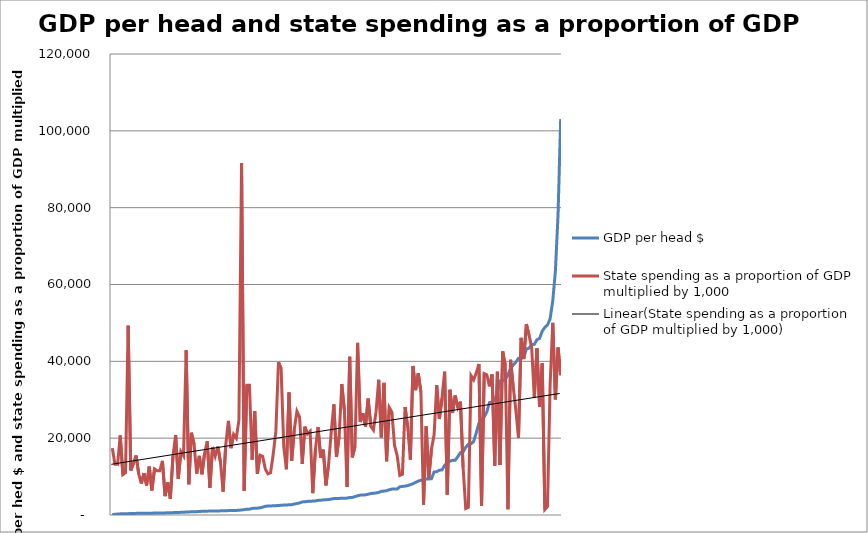
| Category | GDP per head $ | State spending as a proportion of GDP multiplied by 1,000 |
|---|---|---|
| 0 | 155.065 | 17400 |
| 1 | 163.799 | 13200 |
| 2 | 252.014 | 13200 |
| 3 | 291.231 | 20700 |
| 4 | 321.624 | 10500 |
| 5 | 331.068 | 11000 |
| 6 | 347.754 | 49300 |
| 7 | 407.973 | 11600 |
| 8 | 420.021 | 13400 |
| 9 | 422.566 | 15500 |
| 10 | 424.452 | 10700 |
| 11 | 425.61 | 8200 |
| 12 | 437.043 | 10900 |
| 13 | 440.746 | 7700 |
| 14 | 465.736 | 12600 |
| 15 | 482.193 | 6400 |
| 16 | 495.56 | 12000 |
| 17 | 497.636 | 11500 |
| 18 | 501.518 | 11500 |
| 19 | 510.363 | 14100 |
| 20 | 545.588 | 4900 |
| 21 | 574.791 | 8500 |
| 22 | 607.947 | 4200 |
| 23 | 617.552 | 15300 |
| 24 | 637.406 | 20800 |
| 25 | 643.698 | 9400 |
| 26 | 704.17 | 16500 |
| 27 | 724.273 | 15400 |
| 28 | 768.714 | 42900 |
| 29 | 806.211 | 8000 |
| 30 | 823.423 | 21400 |
| 31 | 847.449 | 18400 |
| 32 | 869.795 | 10800 |
| 33 | 899.881 | 15400 |
| 34 | 976.551 | 10600 |
| 35 | 980.614 | 16100 |
| 36 | 990.592 | 19200 |
| 37 | 1036.032 | 7100 |
| 38 | 1040.982 | 17700 |
| 39 | 1043.067 | 15300 |
| 40 | 1056.51 | 17800 |
| 41 | 1076.812 | 13800 |
| 42 | 1095.672 | 6100 |
| 43 | 1113.338 | 18200 |
| 44 | 1147.938 | 24500 |
| 45 | 1157.576 | 17400 |
| 46 | 1180.83 | 21000 |
| 47 | 1193.402 | 20000 |
| 48 | 1225.746 | 24700 |
| 49 | 1300 | 91600 |
| 50 | 1396.537 | 6300 |
| 51 | 1516.234 | 33800 |
| 52 | 1516.419 | 33800 |
| 53 | 1712.529 | 14400 |
| 54 | 1749.576 | 27000 |
| 55 | 1792.373 | 10700 |
| 56 | 1873.687 | 15600 |
| 57 | 2024.498 | 15300 |
| 58 | 2270.898 | 12000 |
| 59 | 2333.704 | 10700 |
| 60 | 2370.406 | 11000 |
| 61 | 2379.536 | 15800 |
| 62 | 2421.1 | 21700 |
| 63 | 2481.697 | 39800 |
| 64 | 2533.191 | 38100 |
| 65 | 2581.301 | 17800 |
| 66 | 2594.422 | 11900 |
| 67 | 2659.658 | 31900 |
| 68 | 2691.167 | 14100 |
| 69 | 2845.506 | 22300 |
| 70 | 3009.615 | 27000 |
| 71 | 3117.318 | 25500 |
| 72 | 3406.522 | 13300 |
| 73 | 3446.394 | 23000 |
| 74 | 3542.954 | 21100 |
| 75 | 3583.138 | 21800 |
| 76 | 3620.281 | 5700 |
| 77 | 3665.074 | 17000 |
| 78 | 3815.336 | 22900 |
| 79 | 3850.652 | 14900 |
| 80 | 3934.695 | 17000 |
| 81 | 3974.819 | 7700 |
| 82 | 4022.746 | 13200 |
| 83 | 4149.068 | 21600 |
| 84 | 4276.221 | 28800 |
| 85 | 4303.995 | 15100 |
| 86 | 4321.656 | 20500 |
| 87 | 4350.649 | 34100 |
| 88 | 4358.974 | 27200 |
| 89 | 4402.088 | 7300 |
| 90 | 4555.851 | 41200 |
| 91 | 4571.149 | 15000 |
| 92 | 4791.597 | 17800 |
| 93 | 5000.893 | 44800 |
| 94 | 5172.159 | 24200 |
| 95 | 5201.835 | 26500 |
| 96 | 5246.142 | 23000 |
| 97 | 5402.985 | 30300 |
| 98 | 5591.954 | 23100 |
| 99 | 5652.672 | 22100 |
| 100 | 5745.034 | 26900 |
| 101 | 5879.676 | 35200 |
| 102 | 6154.143 | 20200 |
| 103 | 6217.001 | 34400 |
| 104 | 6318.966 | 14000 |
| 105 | 6571.885 | 28000 |
| 106 | 6748.163 | 26800 |
| 107 | 6754.819 | 18100 |
| 108 | 6765.35 | 15500 |
| 109 | 7341.772 | 10300 |
| 110 | 7438.29 | 10600 |
| 111 | 7523.526 | 28100 |
| 112 | 7653.2 | 22900 |
| 113 | 7894.242 | 14400 |
| 114 | 8134.956 | 38800 |
| 115 | 8479.762 | 32500 |
| 116 | 8842.574 | 36900 |
| 117 | 9023.529 | 32000 |
| 118 | 9219.371 | 2700 |
| 119 | 9350.534 | 23100 |
| 120 | 9382.265 | 9700 |
| 121 | 9447.072 | 17100 |
| 122 | 11189.546 | 20900 |
| 123 | 11271.517 | 33800 |
| 124 | 11660.79 | 25000 |
| 125 | 11734.466 | 30400 |
| 126 | 12923.2 | 37300 |
| 127 | 13623.968 | 5300 |
| 128 | 13988.327 | 32600 |
| 129 | 14248.027 | 26600 |
| 130 | 14268.657 | 31100 |
| 131 | 15163.69 | 28000 |
| 132 | 16247.928 | 29500 |
| 133 | 16384.938 | 12400 |
| 134 | 17633.478 | 1700 |
| 135 | 18382.1 | 2000 |
| 136 | 18531.202 | 36300 |
| 137 | 19122.596 | 35200 |
| 138 | 21427.228 | 37000 |
| 139 | 23846.899 | 39300 |
| 140 | 25043.371 | 2400 |
| 141 | 25540.842 | 36800 |
| 142 | 26845.943 | 36500 |
| 143 | 29258.801 | 33500 |
| 144 | 29426.434 | 36600 |
| 145 | 29988.614 | 12800 |
| 146 | 31776.35 | 37300 |
| 147 | 34889.677 | 13000 |
| 148 | 35065.064 | 42600 |
| 149 | 35221.262 | 39000 |
| 150 | 36479.843 | 1500 |
| 151 | 38144.654 | 40400 |
| 152 | 39019.831 | 33400 |
| 153 | 39783.342 | 27400 |
| 154 | 40774.908 | 20100 |
| 155 | 40888.047 | 46100 |
| 156 | 40989.218 | 40600 |
| 157 | 43219.616 | 49700 |
| 158 | 43442.926 | 46800 |
| 159 | 44355.44 | 43600 |
| 160 | 44408.818 | 30500 |
| 161 | 45610.892 | 43400 |
| 162 | 45969.156 | 28200 |
| 163 | 47842.051 | 39500 |
| 164 | 48863.395 | 1400 |
| 165 | 49475.236 | 2200 |
| 166 | 51087.688 | 34000 |
| 167 | 55790.043 | 50000 |
| 168 | 63556.926 | 30100 |
| 169 | 78147.317 | 43600 |
| 170 | 103067.729 | 36400 |